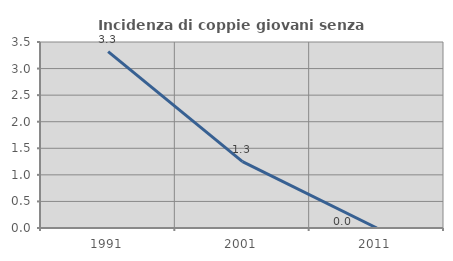
| Category | Incidenza di coppie giovani senza figli |
|---|---|
| 1991.0 | 3.318 |
| 2001.0 | 1.25 |
| 2011.0 | 0 |